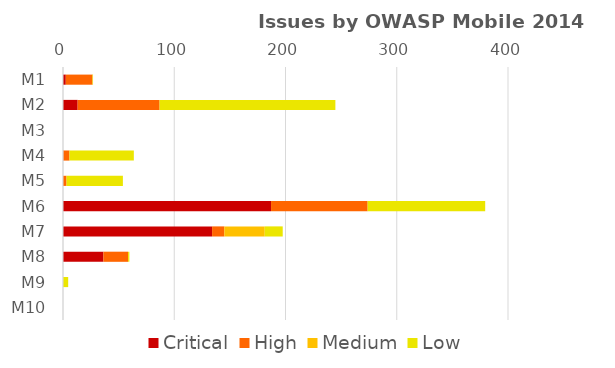
| Category | Critical | High | Medium | Low |
|---|---|---|---|---|
| M1 | 2.5 | 24 | 0 | 0.5 |
| M2 | 13.167 | 73.667 | 0 | 158 |
| M3 | 0 | 0 | 0 | 0 |
| M4 | 0.333 | 5.5 | 0 | 57.833 |
| M5 | 0 | 3.167 | 0 | 50.667 |
| M6 | 187 | 86.833 | 0 | 105.667 |
| M7 | 134 | 11 | 36.333 | 16.167 |
| M8 | 36.333 | 22.167 | 0 | 1.167 |
| M9 | 0 | 0 | 0 | 4.667 |
| M10 | 0 | 0 | 0 | 0 |